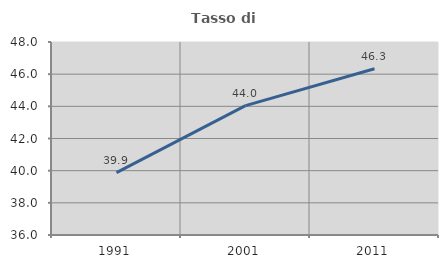
| Category | Tasso di occupazione   |
|---|---|
| 1991.0 | 39.88 |
| 2001.0 | 44.044 |
| 2011.0 | 46.34 |